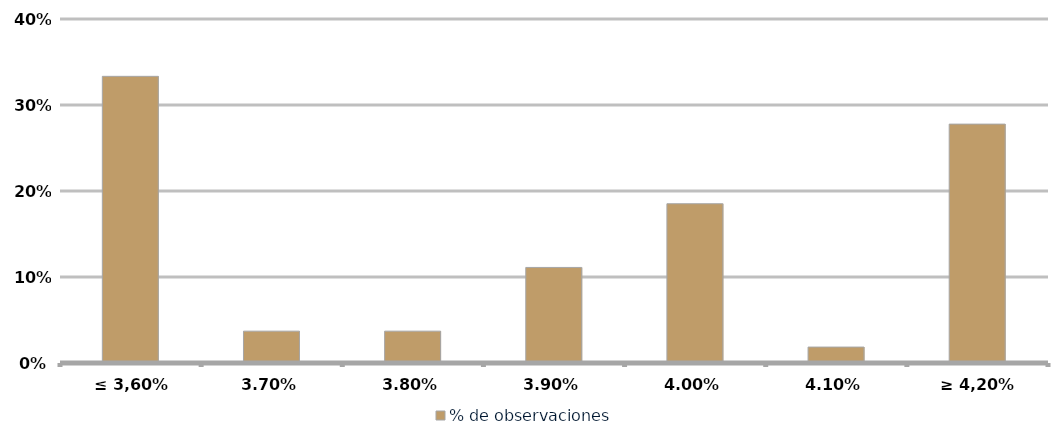
| Category | % de observaciones  |
|---|---|
|  ≤ 3,60%  | 0.333 |
| 3,70% | 0.037 |
| 3,80% | 0.037 |
| 3,90% | 0.111 |
| 4,00% | 0.185 |
| 4,10% | 0.019 |
| ≥ 4,20% | 0.278 |